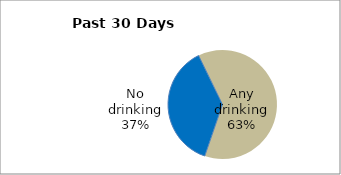
| Category | Series 0 |
|---|---|
| No drinking | 37.493 |
| Any drinking | 62.507 |